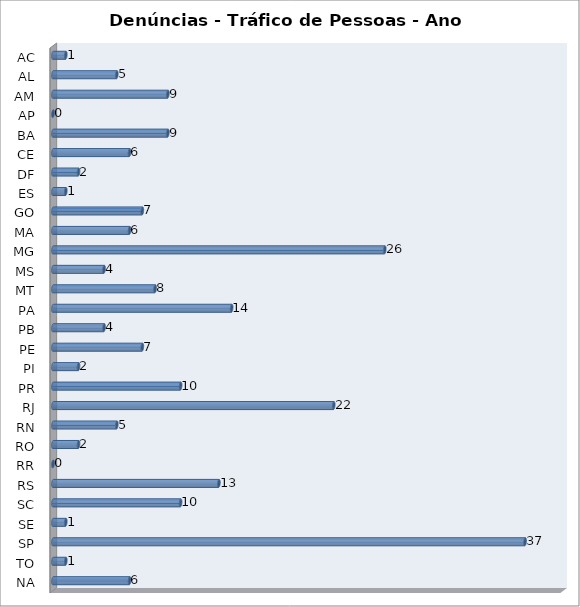
| Category | Series 0 |
|---|---|
| AC | 1 |
| AL | 5 |
| AM | 9 |
| AP | 0 |
| BA | 9 |
| CE | 6 |
| DF | 2 |
| ES | 1 |
| GO | 7 |
| MA | 6 |
| MG | 26 |
| MS | 4 |
| MT | 8 |
| PA | 14 |
| PB | 4 |
| PE | 7 |
| PI | 2 |
| PR | 10 |
| RJ | 22 |
| RN | 5 |
| RO | 2 |
| RR | 0 |
| RS | 13 |
| SC | 10 |
| SE | 1 |
| SP | 37 |
| TO | 1 |
| NA | 6 |